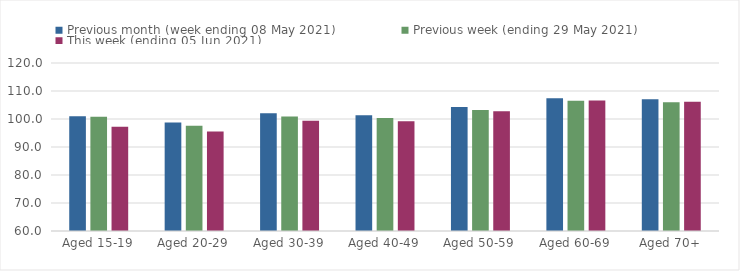
| Category | Previous month (week ending 08 May 2021) | Previous week (ending 29 May 2021) | This week (ending 05 Jun 2021) |
|---|---|---|---|
| Aged 15-19 | 100.96 | 100.84 | 97.19 |
| Aged 20-29 | 98.76 | 97.56 | 95.58 |
| Aged 30-39 | 102.02 | 100.92 | 99.38 |
| Aged 40-49 | 101.36 | 100.39 | 99.17 |
| Aged 50-59 | 104.29 | 103.23 | 102.75 |
| Aged 60-69 | 107.44 | 106.48 | 106.61 |
| Aged 70+ | 107.07 | 105.95 | 106.17 |